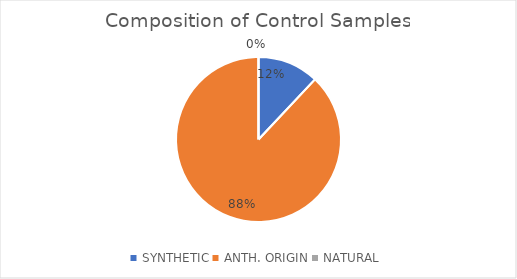
| Category | Series 0 |
|---|---|
| SYNTHETIC | 0.12 |
| ANTH. ORIGIN | 0.88 |
| NATURAL | 0 |